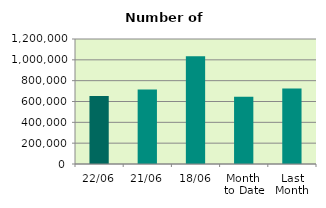
| Category | Series 0 |
|---|---|
| 22/06 | 651908 |
| 21/06 | 715674 |
| 18/06 | 1034342 |
| Month 
to Date | 645796.5 |
| Last
Month | 723791.905 |